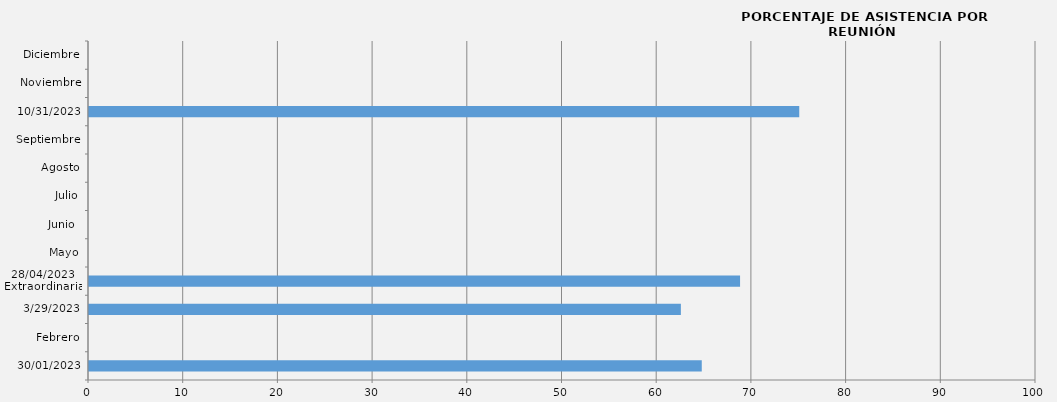
| Category | 30/01/2023 |
|---|---|
| 30/01/2023 | 64.706 |
| Febrero | 0 |
| 29/03/2023 | 62.5 |
| 28/04/2023
Extraordinaria | 68.75 |
| Mayo | 0 |
| Junio  | 0 |
| Julio | 0 |
| Agosto | 0 |
| Septiembre | 0 |
| 31/10/2023 | 75 |
| Noviembre | 0 |
| Diciembre | 0 |